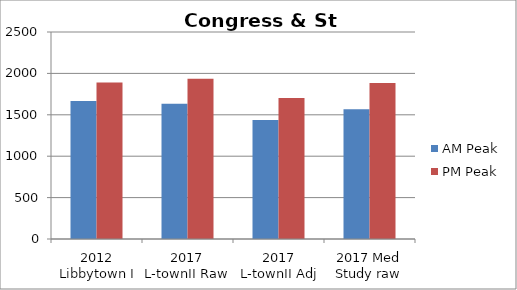
| Category | AM Peak | PM Peak |
|---|---|---|
| 2012 Libbytown I | 1666 | 1889 |
| 2017 L-townII Raw | 1633 | 1935 |
| 2017 L-townII Adj | 1437 | 1703 |
| 2017 Med Study raw | 1566 | 1884 |